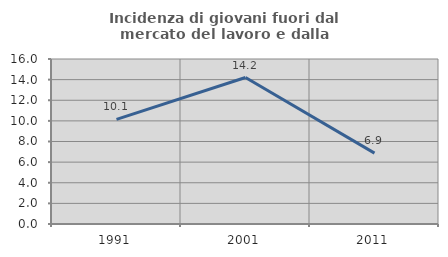
| Category | Incidenza di giovani fuori dal mercato del lavoro e dalla formazione  |
|---|---|
| 1991.0 | 10.145 |
| 2001.0 | 14.201 |
| 2011.0 | 6.87 |